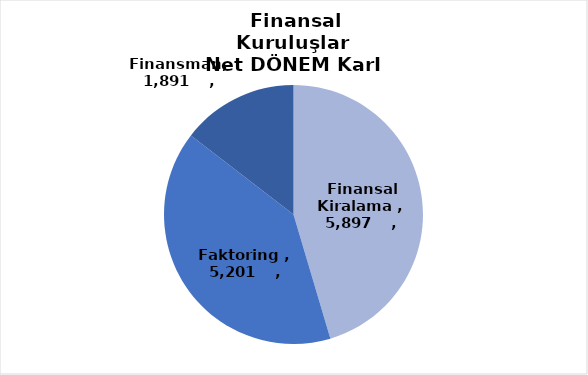
| Category | Series 0 |
|---|---|
| Finansal Kiralama  | 5897 |
| Faktoring  | 5201 |
| Finansman | 1891 |